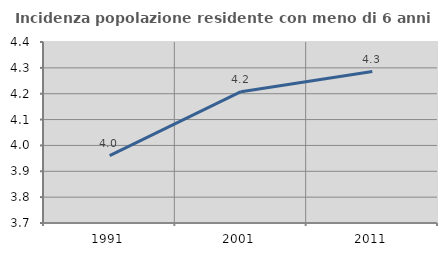
| Category | Incidenza popolazione residente con meno di 6 anni |
|---|---|
| 1991.0 | 3.96 |
| 2001.0 | 4.208 |
| 2011.0 | 4.286 |